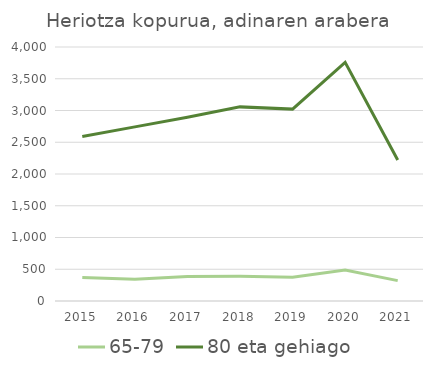
| Category | 65-79 | 80 eta gehiago |
|---|---|---|
| 2015.0 | 370 | 2589 |
| 2016.0 | 341 | 2742 |
| 2017.0 | 386 | 2895 |
| 2018.0 | 389 | 3057 |
| 2019.0 | 374 | 3022 |
| 2020.0 | 488 | 3758 |
| 2021.0 | 321 | 2221 |